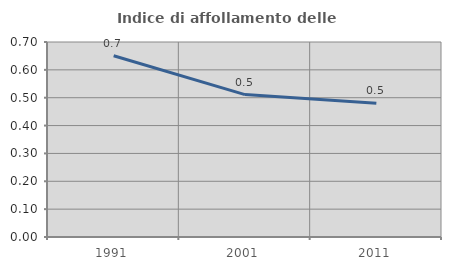
| Category | Indice di affollamento delle abitazioni  |
|---|---|
| 1991.0 | 0.651 |
| 2001.0 | 0.511 |
| 2011.0 | 0.48 |